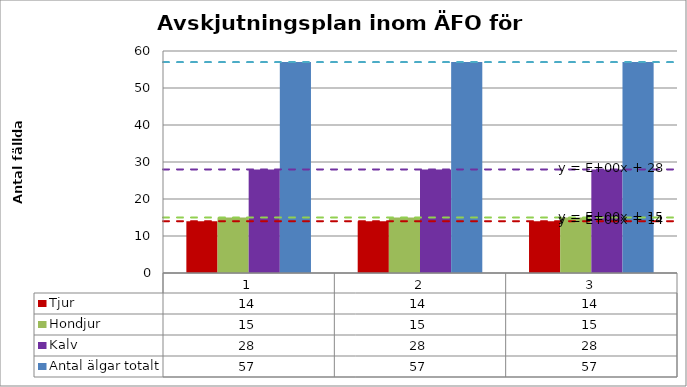
| Category | Tjur | Hondjur | Kalv | Antal älgar totalt |
|---|---|---|---|---|
| 0 | 14 | 15 | 28 | 57 |
| 1 | 14 | 15 | 28 | 57 |
| 2 | 14 | 15 | 28 | 57 |